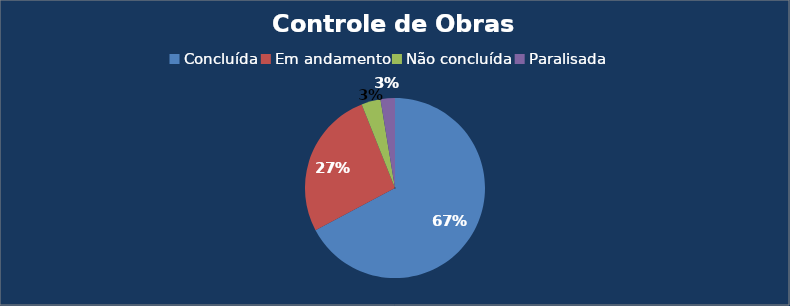
| Category | Contar de Status da Obra     (Homologada, Em Andamento; Concluída; Paralisada e Não Concluída) | Contar de Status da Obra     (Homologada, Em Andamento; Concluída; Paralisada e Não Concluída)2 |
|---|---|---|
| Concluída | 78 | 0.672 |
| Em andamento | 31 | 0.267 |
| Não concluída | 4 | 0.034 |
| Paralisada | 3 | 0.026 |